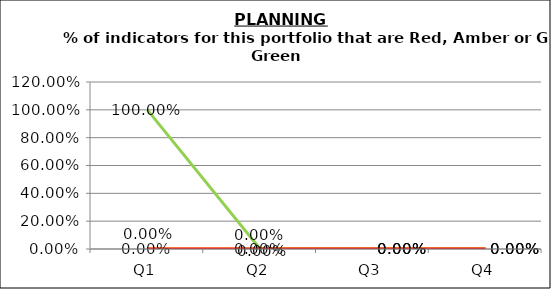
| Category | Green | Amber | Red |
|---|---|---|---|
| Q1 | 1 | 0 | 0 |
| Q2 | 0 | 0 | 0 |
| Q3 | 0 | 0 | 0 |
| Q4 | 0 | 0 | 0 |